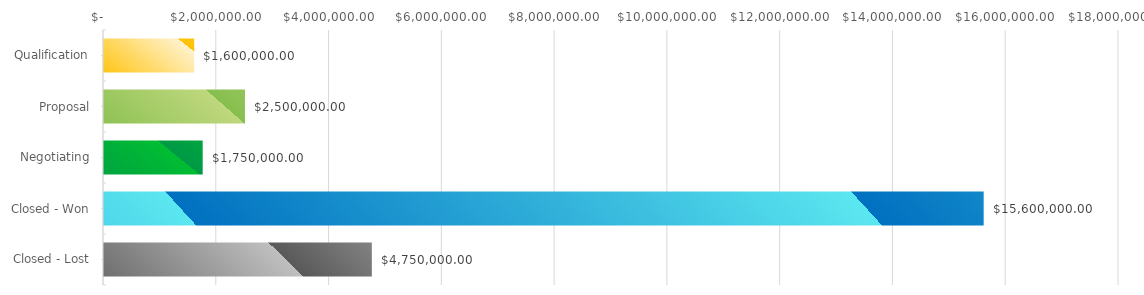
| Category | Series 0 |
|---|---|
| Qualification | 1600000 |
| Proposal | 2500000 |
| Negotiating | 1750000 |
| Closed - Won | 15600000 |
| Closed - Lost | 4750000 |